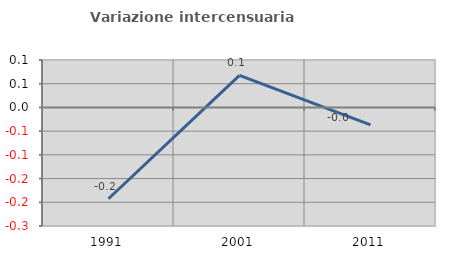
| Category | Variazione intercensuaria annua |
|---|---|
| 1991.0 | -0.193 |
| 2001.0 | 0.068 |
| 2011.0 | -0.037 |